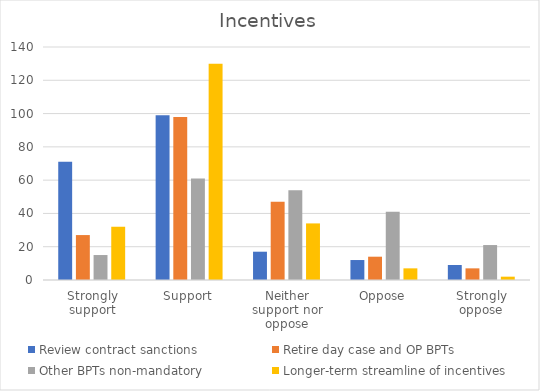
| Category | Review contract sanctions | Retire day case and OP BPTs | Other BPTs non-mandatory | Longer-term streamline of incentives |
|---|---|---|---|---|
| Strongly support | 71 | 27 | 15 | 32 |
| Support | 99 | 98 | 61 | 130 |
| Neither support nor oppose | 17 | 47 | 54 | 34 |
| Oppose | 12 | 14 | 41 | 7 |
| Strongly oppose | 9 | 7 | 21 | 2 |